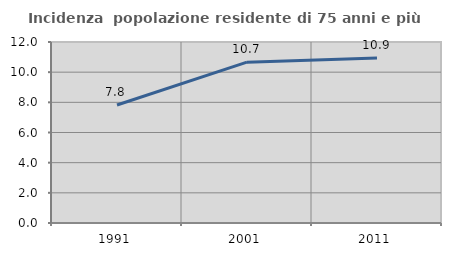
| Category | Incidenza  popolazione residente di 75 anni e più |
|---|---|
| 1991.0 | 7.821 |
| 2001.0 | 10.661 |
| 2011.0 | 10.933 |